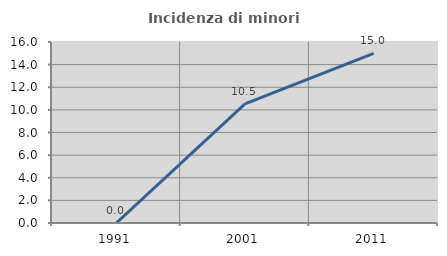
| Category | Incidenza di minori stranieri |
|---|---|
| 1991.0 | 0 |
| 2001.0 | 10.526 |
| 2011.0 | 15 |